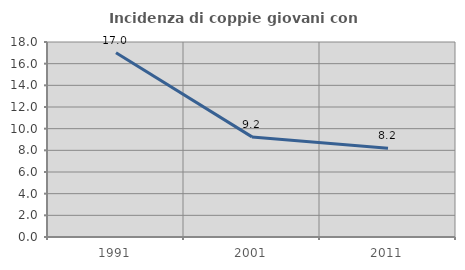
| Category | Incidenza di coppie giovani con figli |
|---|---|
| 1991.0 | 16.999 |
| 2001.0 | 9.241 |
| 2011.0 | 8.195 |